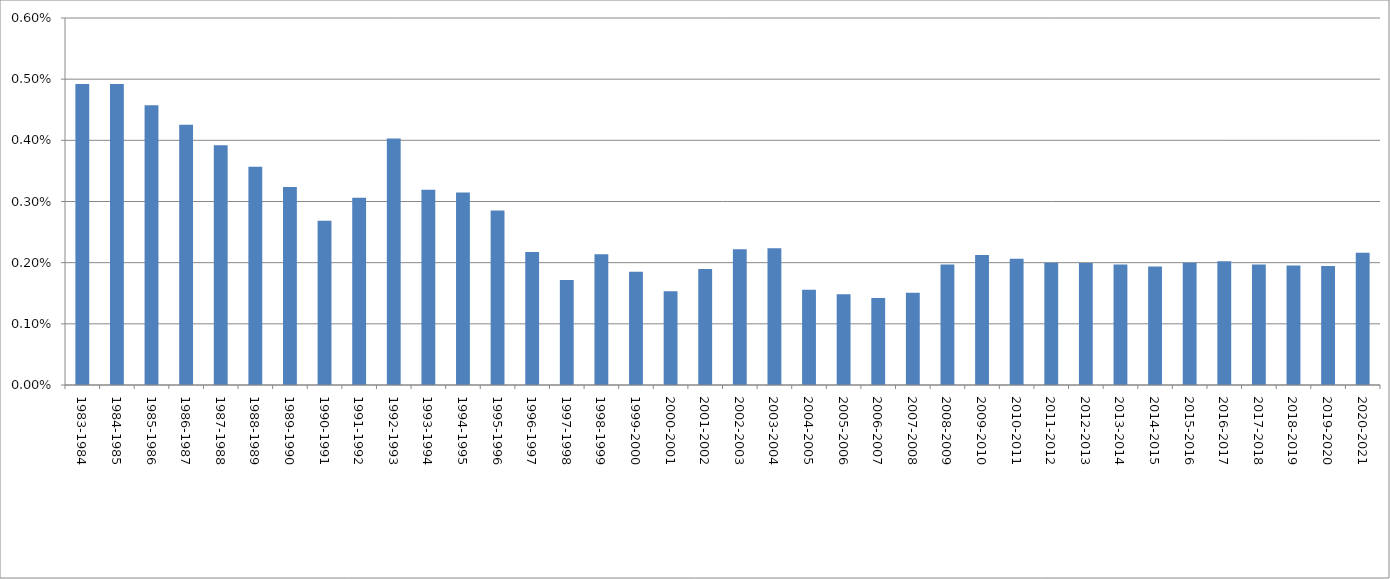
| Category | Series 0 |
|---|---|
| 1983-1984 | 0.005 |
| 1984-1985 | 0.005 |
| 1985-1986 | 0.005 |
| 1986-1987 | 0.004 |
| 1987-1988 | 0.004 |
| 1988-1989 | 0.004 |
| 1989-1990 | 0.003 |
| 1990-1991 | 0.003 |
| 1991-1992 | 0.003 |
| 1992-1993 | 0.004 |
| 1993-1994 | 0.003 |
| 1994-1995 | 0.003 |
| 1995-1996 | 0.003 |
| 1996-1997 | 0.002 |
| 1997-1998 | 0.002 |
| 1998-1999 | 0.002 |
| 1999-2000 | 0.002 |
| 2000-2001 | 0.002 |
| 2001-2002 | 0.002 |
| 2002-2003 | 0.002 |
| 2003-2004 | 0.002 |
| 2004-2005 | 0.002 |
| 2005-2006 | 0.001 |
| 2006-2007 | 0.001 |
| 2007-2008 | 0.002 |
| 2008-2009 | 0.002 |
| 2009-2010 | 0.002 |
| 2010-2011 | 0.002 |
| 2011-2012 | 0.002 |
| 2012-2013 | 0.002 |
| 2013-2014 | 0.002 |
| 2014-2015 | 0.002 |
| 2015-2016 | 0.002 |
| 2016-2017 | 0.002 |
| 2017-2018 | 0.002 |
| 2018-2019 | 0.002 |
| 2019-2020 | 0.002 |
| 2020-2021 | 0.002 |